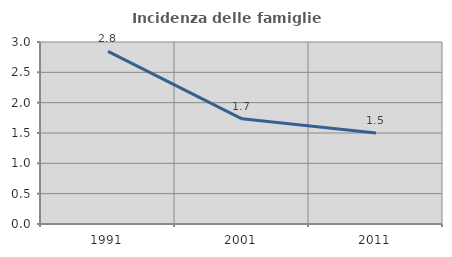
| Category | Incidenza delle famiglie numerose |
|---|---|
| 1991.0 | 2.846 |
| 2001.0 | 1.734 |
| 2011.0 | 1.5 |